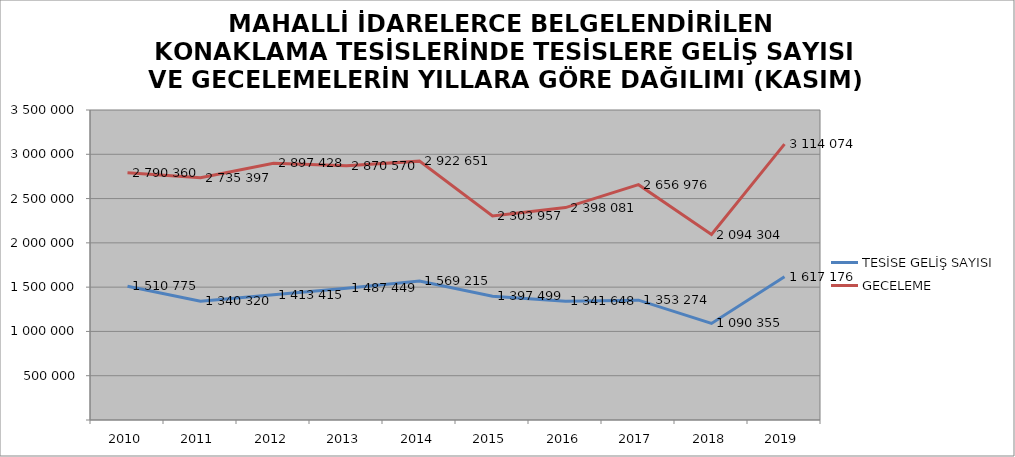
| Category | TESİSE GELİŞ SAYISI | GECELEME |
|---|---|---|
| 2010 | 1510775 | 2790360 |
| 2011 | 1340320 | 2735397 |
| 2012 | 1413415 | 2897428 |
| 2013 | 1487449 | 2870570 |
| 2014 | 1569215 | 2922651 |
| 2015 | 1397499 | 2303957 |
| 2016 | 1341648 | 2398081 |
| 2017 | 1353274 | 2656976 |
| 2018 | 1090355 | 2094304 |
| 2019 | 1617176 | 3114074 |